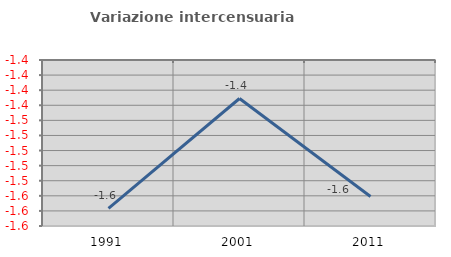
| Category | Variazione intercensuaria annua |
|---|---|
| 1991.0 | -1.577 |
| 2001.0 | -1.431 |
| 2011.0 | -1.561 |